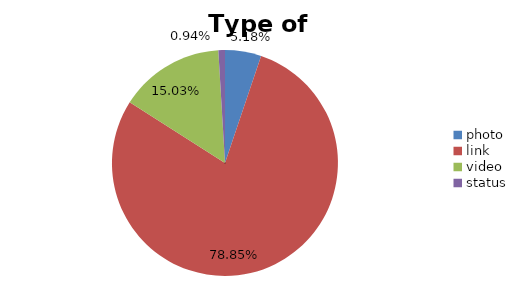
| Category | Series 1 | Number |
|---|---|---|
| photo | 0.052 | 176 |
| link | 0.789 | 2681 |
| video | 0.15 | 511 |
| status | 0.009 | 32 |